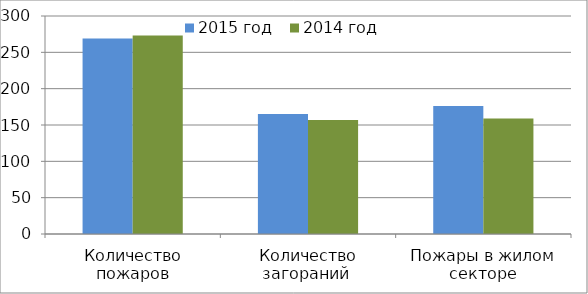
| Category | 2015 год | 2014 год |
|---|---|---|
| Количество пожаров | 269 | 273 |
| Количество загораний  | 165 | 157 |
| Пожары в жилом секторе | 176 | 159 |